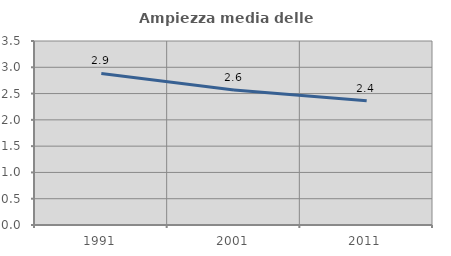
| Category | Ampiezza media delle famiglie |
|---|---|
| 1991.0 | 2.882 |
| 2001.0 | 2.568 |
| 2011.0 | 2.362 |